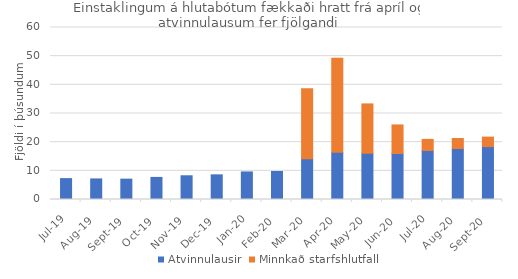
| Category | Atvinnulausir | Minnkað starfshlutfall |
|---|---|---|
| 2019-07-01 | 7.285 | 0 |
| 2019-08-01 | 7.181 | 0 |
| 2019-09-01 | 7.101 | 0 |
| 2019-10-01 | 7.7 | 0 |
| 2019-11-01 | 8.279 | 0 |
| 2019-12-01 | 8.605 | 0 |
| 2020-01-01 | 9.618 | 0 |
| 2020-02-01 | 9.766 | 0 |
| 2020-03-01 | 14.221 | 24.399 |
| 2020-04-01 | 16.443 | 32.802 |
| 2020-05-01 | 16.134 | 17.213 |
| 2020-06-01 | 16.028 | 9.984 |
| 2020-07-01 | 17.104 | 3.862 |
| 2020-08-01 | 17.788 | 3.483 |
| 2020-09-01 | 18.443 | 3.317 |